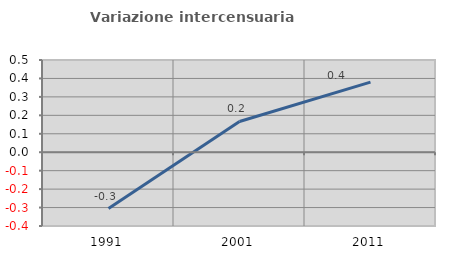
| Category | Variazione intercensuaria annua |
|---|---|
| 1991.0 | -0.305 |
| 2001.0 | 0.167 |
| 2011.0 | 0.38 |